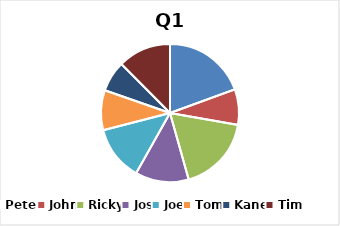
| Category | Q1 Efficiency |
|---|---|
| Peter | 0.99 |
| John | 0.423 |
| Ricky | 0.91 |
| Jos | 0.637 |
| Joe | 0.652 |
| Tom | 0.477 |
| Kane | 0.367 |
| Tim | 0.634 |